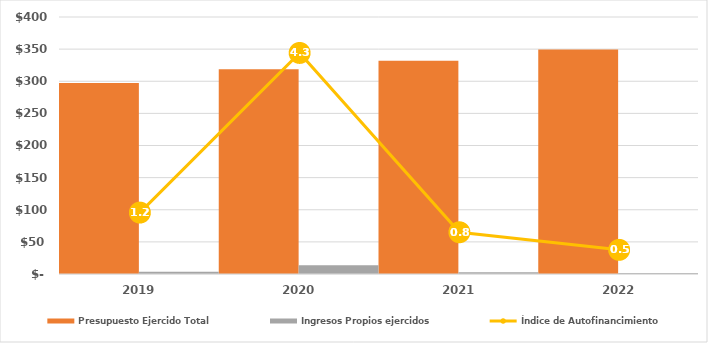
| Category | Presupuesto Ejercido Total | Ingresos Propios ejercidos |
|---|---|---|
| 2019.0 | 297383.7 | 3552.847 |
| 2020.0 | 318785.247 | 13709.89 |
| 2021.0 | 331789.211 | 2693.74 |
| 2022.0 | 349320.095 | 1640.453 |